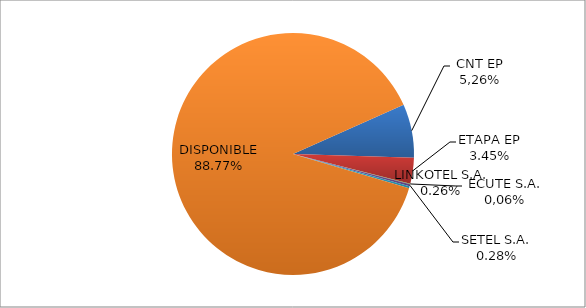
| Category | CODIGO DE AREA 7 |
|---|---|
| CORPORACIÓN NACIONAL TELECOMUNICACIONES CNT EP | 0.072 |
| ETAPA EP | 0.035 |
| CONECEL (ex ECUADORTELECOM S.A.) | 0.001 |
| SETEL S.A. | 0.003 |
| LINKOTEL S.A. | 0.003 |
| DISPONIBLE | 0.888 |